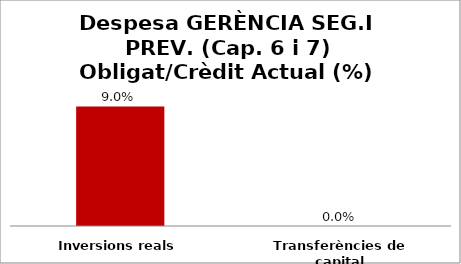
| Category | Series 0 |
|---|---|
| Inversions reals | 0.09 |
| Transferències de capital | 0 |